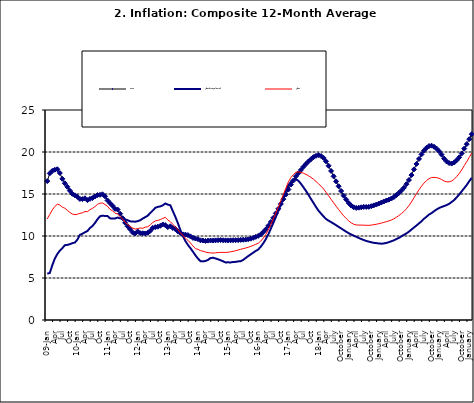
| Category | Food | All Items less Farm Produce | All Items |
|---|---|---|---|
| 09-Jan | 16.536 | 5.519 | 12.032 |
| Feb | 17.454 | 5.591 | 12.567 |
| Mar | 17.742 | 6.51 | 13.101 |
| Apr | 17.89 | 7.302 | 13.51 |
| May | 17.949 | 7.847 | 13.787 |
| June | 17.498 | 8.259 | 13.694 |
| Jul | 16.808 | 8.554 | 13.437 |
| Aug | 16.278 | 8.906 | 13.307 |
| Sep | 15.859 | 8.942 | 13.065 |
| Oct | 15.396 | 9.024 | 12.803 |
| Nov | 15.018 | 9.143 | 12.609 |
| Dec | 14.841 | 9.226 | 12.538 |
| 10-Jan | 14.668 | 9.567 | 12.586 |
| Feb | 14.411 | 10.138 | 12.7 |
| Mar | 14.395 | 10.269 | 12.757 |
| Apr | 14.489 | 10.444 | 12.915 |
| May | 14.266 | 10.597 | 12.893 |
| Jun | 14.424 | 10.948 | 13.132 |
| Jul | 14.514 | 11.193 | 13.284 |
| Aug | 14.706 | 11.549 | 13.5 |
| Sep | 14.872 | 11.997 | 13.764 |
| Oct | 14.906 | 12.345 | 13.908 |
| Nov | 14.967 | 12.423 | 13.928 |
| Dec | 14.723 | 12.383 | 13.74 |
| 11-Jan | 14.233 | 12.385 | 13.542 |
| Feb | 13.903 | 12.099 | 13.161 |
| Mar | 13.606 | 12.077 | 13.001 |
| Apr | 13.227 | 12.088 | 12.694 |
| May | 13.152 | 12.198 | 12.648 |
| Jun | 12.654 | 12.1 | 12.321 |
| Jul | 12.118 | 12.109 | 12.009 |
| Aug | 11.575 | 11.98 | 11.635 |
| Sep | 11.155 | 11.877 | 11.363 |
| Oct | 10.797 | 11.746 | 11.13 |
| Nov | 10.422 | 11.721 | 10.952 |
| Dec | 10.298 | 11.706 | 10.826 |
| 12-Jan | 10.538 | 11.765 | 10.886 |
| 12-Feb | 10.336 | 11.872 | 10.955 |
| 12-Mar | 10.325 | 12.075 | 10.914 |
| Apr | 10.304 | 12.242 | 11.054 |
| May | 10.387 | 12.419 | 11.096 |
| Jun | 10.617 | 12.732 | 11.32 |
| Jul | 10.963 | 13.032 | 11.599 |
| Aug | 11.056 | 13.349 | 11.791 |
| Sep | 11.104 | 13.467 | 11.859 |
| Oct | 11.216 | 13.525 | 11.948 |
| Nov | 11.372 | 13.649 | 12.091 |
| Dec | 11.296 | 13.873 | 12.224 |
| 13-Jan | 11.055 | 13.737 | 11.908 |
| Feb | 11.153 | 13.657 | 11.703 |
| Mar | 10.951 | 12.963 | 11.394 |
| Apr | 10.844 | 12.281 | 11.072 |
| May | 10.548 | 11.531 | 10.761 |
| Jun | 10.352 | 10.704 | 10.383 |
| Jul | 10.186 | 10.005 | 10.047 |
| Aug | 10.168 | 9.4 | 9.761 |
| Sep | 10.105 | 8.939 | 9.486 |
| Oct | 9.955 | 8.553 | 9.167 |
| Nov | 9.774 | 8.136 | 8.815 |
| Dec | 9.695 | 7.691 | 8.496 |
| 14-Jan | 9.626 | 7.317 | 8.408 |
| Feb | 9.484 | 7.005 | 8.257 |
| Mar | 9.464 | 6.976 | 8.19 |
| Apr | 9.416 | 7.03 | 8.092 |
| May | 9.448 | 7.151 | 8.012 |
| Jun | 9.464 | 7.369 | 7.998 |
| Jul | 9.459 | 7.411 | 7.968 |
| Aug | 9.481 | 7.325 | 7.996 |
| Sep | 9.501 | 7.228 | 8.027 |
| Oct | 9.508 | 7.116 | 8.047 |
| Nov | 9.492 | 6.991 | 8.046 |
| Dec | 9.481 | 6.854 | 8.047 |
| 15-Jan | 9.475 | 6.865 | 8.063 |
| Feb | 9.486 | 6.852 | 8.117 |
| Mar | 9.495 | 6.905 | 8.176 |
| Apr | 9.501 | 6.922 | 8.243 |
| May | 9.51 | 6.975 | 8.331 |
| Jun | 9.535 | 7.006 | 8.417 |
| Jul | 9.552 | 7.154 | 8.497 |
| Aug | 9.571 | 7.384 | 8.566 |
| Sep | 9.614 | 7.605 | 8.658 |
| Oct | 9.68 | 7.812 | 8.76 |
| Nov | 9.778 | 8.016 | 8.879 |
| Dec | 9.898 | 8.222 | 9.009 |
| 16-Jan | 10.017 | 8.391 | 9.13 |
| Feb | 10.184 | 8.732 | 9.386 |
| Mar | 10.471 | 9.132 | 9.751 |
| Apr | 10.786 | 9.614 | 10.182 |
| May | 11.221 | 10.196 | 10.746 |
| Jun | 11.672 | 10.864 | 11.372 |
| Jul | 12.162 | 11.553 | 12.045 |
| Aug | 12.696 | 12.247 | 12.744 |
| Sep | 13.238 | 12.98 | 13.454 |
| Oct | 13.817 | 13.757 | 14.206 |
| Nov | 14.386 | 14.542 | 14.958 |
| Dec | 14.946 | 15.307 | 15.697 |
| 17-Jan | 15.536 | 16.042 | 16.441 |
| Feb | 16.127 | 16.436 | 16.958 |
| Mar | 16.598 | 16.682 | 17.315 |
| Apr | 17.106 | 16.772 | 17.591 |
| May | 17.477 | 16.567 | 17.628 |
| Jun | 17.868 | 16.219 | 17.578 |
| Jul | 18.247 | 15.798 | 17.475 |
| Aug | 18.569 | 15.372 | 17.331 |
| Sep | 18.876 | 14.903 | 17.17 |
| Oct | 19.14 | 14.415 | 16.968 |
| Nov | 19.392 | 13.93 | 16.76 |
| Dec | 19.546 | 13.458 | 16.502 |
| 18-Jan | 19.621 | 13.01 | 16.215 |
| Feb | 19.521 | 12.668 | 15.93 |
| Mar | 19.294 | 12.33 | 15.599 |
| Apr | 18.886 | 12.021 | 15.196 |
| May | 18.359 | 11.828 | 14.793 |
| June | 17.745 | 11.651 | 14.371 |
| July | 17.102 | 11.478 | 13.95 |
| August | 16.501 | 11.285 | 13.546 |
| September | 15.923 | 11.092 | 13.157 |
| October | 15.355 | 10.903 | 12.777 |
| November | 14.802 | 10.703 | 12.406 |
| December | 14.348 | 10.514 | 12.095 |
| January | 13.934 | 10.339 | 11.801 |
| February | 13.62 | 10.185 | 11.564 |
| March | 13.42 | 10.044 | 11.401 |
| April | 13.339 | 9.909 | 11.314 |
| May | 13.371 | 9.77 | 11.299 |
| June | 13.418 | 9.64 | 11.297 |
| July | 13.46 | 9.524 | 11.291 |
| August | 13.458 | 9.411 | 11.271 |
| September | 13.474 | 9.337 | 11.268 |
| October | 13.544 | 9.253 | 11.298 |
| November | 13.646 | 9.189 | 11.348 |
| December | 13.743 | 9.155 | 11.396 |
| January | 13.859 | 9.112 | 11.462 |
| February | 13.98 | 9.086 | 11.539 |
| March | 14.109 | 9.112 | 11.624 |
| April | 14.221 | 9.174 | 11.706 |
| May | 14.325 | 9.267 | 11.791 |
| June | 14.46 | 9.375 | 11.904 |
| July | 14.634 | 9.484 | 12.049 |
| August | 14.869 | 9.638 | 12.233 |
| September | 15.135 | 9.775 | 12.44 |
| October | 15.416 | 9.965 | 12.664 |
| November | 15.746 | 10.136 | 12.923 |
| December | 16.169 | 10.308 | 13.246 |
| January | 16.662 | 10.519 | 13.616 |
| February | 17.251 | 10.767 | 14.053 |
| March | 17.929 | 11.015 | 14.554 |
| April | 18.576 | 11.247 | 15.039 |
| May | 19.176 | 11.502 | 15.499 |
| June | 19.721 | 11.75 | 15.927 |
| July | 20.165 | 12.052 | 16.298 |
| August | 20.499 | 12.291 | 16.601 |
| September | 20.711 | 12.553 | 16.83 |
| October | 20.753 | 12.725 | 16.958 |
| November | 20.619 | 12.956 | 16.979 |
| December | 20.403 | 13.161 | 16.953 |
| January | 20.089 | 13.326 | 16.869 |
| February | 19.687 | 13.461 | 16.728 |
| March | 19.214 | 13.562 | 16.544 |
| April | 18.876 | 13.681 | 16.449 |
| May | 18.679 | 13.83 | 16.449 |
| June | 18.619 | 14.057 | 16.542 |
| July | 18.745 | 14.278 | 16.755 |
| August | 19.021 | 14.603 | 17.07 |
| September | 19.365 | 14.934 | 17.432 |
| October | 19.829 | 15.315 | 17.865 |
| November | 20.407 | 15.687 | 18.372 |
| December | 20.937 | 16.075 | 18.847 |
| January | 21.53 | 16.519 | 19.362 |
| February | 22.124 | 16.92 | 19.873 |